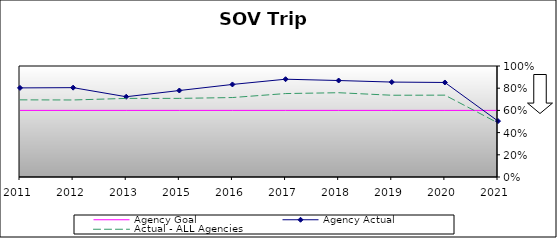
| Category | Agency Goal | Agency Actual | Actual - ALL Agencies |
|---|---|---|---|
| 2011.0 | 0.6 | 0.803 | 0.695 |
| 2012.0 | 0.6 | 0.805 | 0.694 |
| 2013.0 | 0.6 | 0.723 | 0.708 |
| 2015.0 | 0.6 | 0.779 | 0.708 |
| 2016.0 | 0.6 | 0.834 | 0.716 |
| 2017.0 | 0.6 | 0.881 | 0.752 |
| 2018.0 | 0.6 | 0.869 | 0.759 |
| 2019.0 | 0.6 | 0.855 | 0.736 |
| 2020.0 | 0.6 | 0.852 | 0.737 |
| 2021.0 | 0.6 | 0.504 | 0.487 |